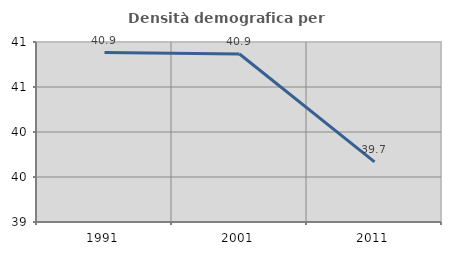
| Category | Densità demografica |
|---|---|
| 1991.0 | 40.883 |
| 2001.0 | 40.866 |
| 2011.0 | 39.667 |